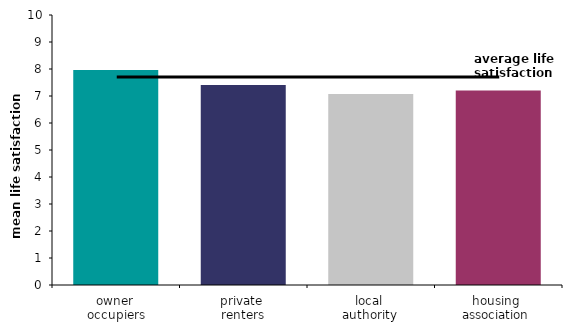
| Category | Series 0 |
|---|---|
| owner 
occupiers | 7.967 |
| private 
renters | 7.411 |
| local 
authority  | 7.073 |
| housing 
association  | 7.202 |